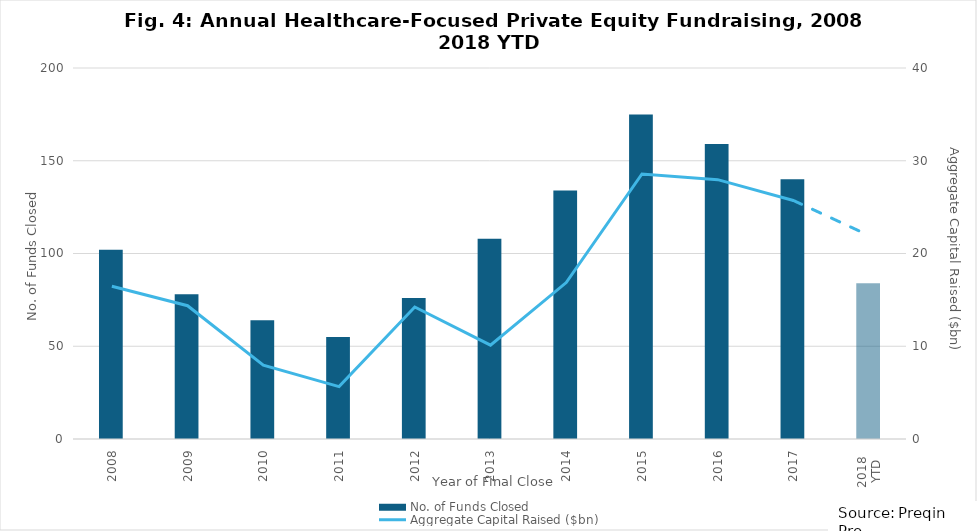
| Category | No. of Funds Closed |
|---|---|
| 2008 | 102 |
| 2009 | 78 |
| 2010 | 64 |
| 2011 | 55 |
| 2012 | 76 |
| 2013 | 108 |
| 2014 | 134 |
| 2015 | 175 |
| 2016 | 159 |
| 2017 | 140 |
| 2018 
YTD | 84 |